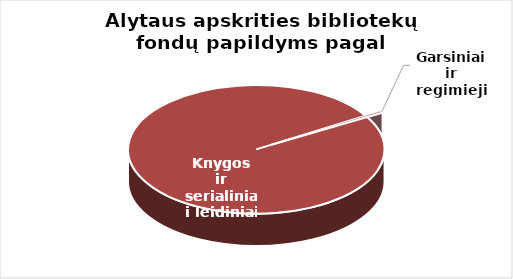
| Category | Series 0 |
|---|---|
| Knygos ir  | 46064 |
| Garsiniai ir regimieji | 204 |